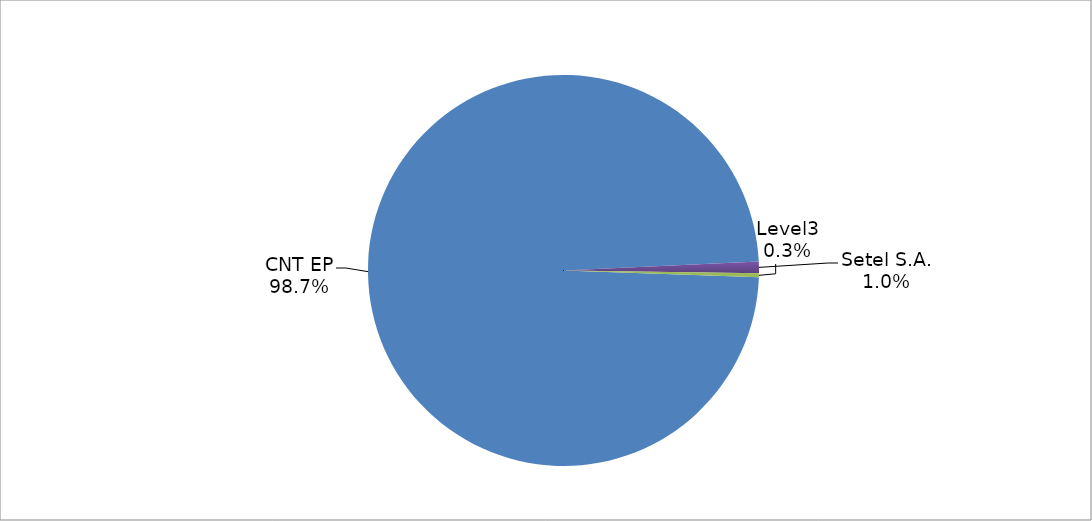
| Category | Series 0 |
|---|---|
| CNT EP | 305 |
| Setel S.A. | 3 |
| Level3 | 1 |